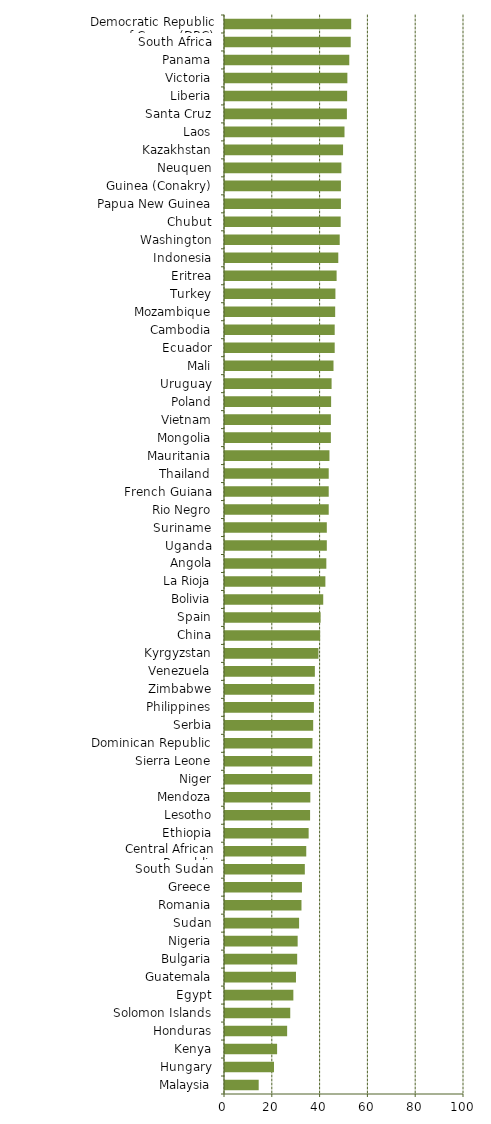
| Category | Series 0 |
|---|---|
| Malaysia | 14.1 |
| Hungary | 20.5 |
| Kenya | 21.8 |
| Honduras | 26 |
| Solomon Islands | 27.3 |
| Egypt | 28.6 |
| Guatemala | 29.7 |
| Bulgaria | 30.2 |
| Nigeria | 30.4 |
| Sudan | 31 |
| Romania | 32 |
| Greece | 32.2 |
| South Sudan | 33.4 |
| Central African Republic | 34 |
| Ethiopia | 35 |
| Lesotho | 35.6 |
| Mendoza | 35.7 |
| Niger | 36.5 |
| Sierra Leone | 36.5 |
| Dominican Republic | 36.6 |
| Serbia | 36.9 |
| Philippines | 37.2 |
| Zimbabwe | 37.4 |
| Venezuela | 37.6 |
| Kyrgyzstan | 39.1 |
| China | 39.8 |
| Spain | 40 |
| Bolivia | 41.1 |
| La Rioja | 42 |
| Angola | 42.4 |
| Uganda | 42.6 |
| Suriname | 42.6 |
| Rio Negro | 43.4 |
| French Guiana | 43.4 |
| Thailand | 43.4 |
| Mauritania | 43.7 |
| Mongolia | 44.3 |
| Vietnam | 44.3 |
| Poland | 44.4 |
| Uruguay | 44.6 |
| Mali | 45.4 |
| Ecuador | 45.9 |
| Cambodia | 45.9 |
| Mozambique | 46.1 |
| Turkey | 46.2 |
| Eritrea | 46.7 |
| Indonesia | 47.4 |
| Washington | 48 |
| Chubut | 48.4 |
| Papua New Guinea | 48.5 |
| Guinea (Conakry) | 48.5 |
| Neuquen | 48.7 |
| Kazakhstan | 49.4 |
| Laos | 50 |
| Santa Cruz | 51 |
| Liberia | 51.1 |
| Victoria | 51.2 |
| Panama | 52 |
| South Africa | 52.6 |
| Democratic Republic of Congo (DRC) | 52.8 |